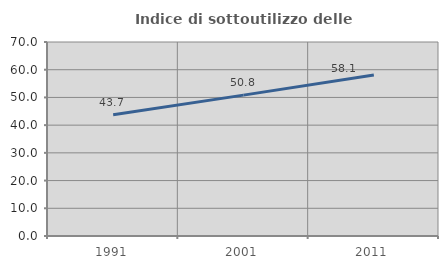
| Category | Indice di sottoutilizzo delle abitazioni  |
|---|---|
| 1991.0 | 43.733 |
| 2001.0 | 50.827 |
| 2011.0 | 58.08 |